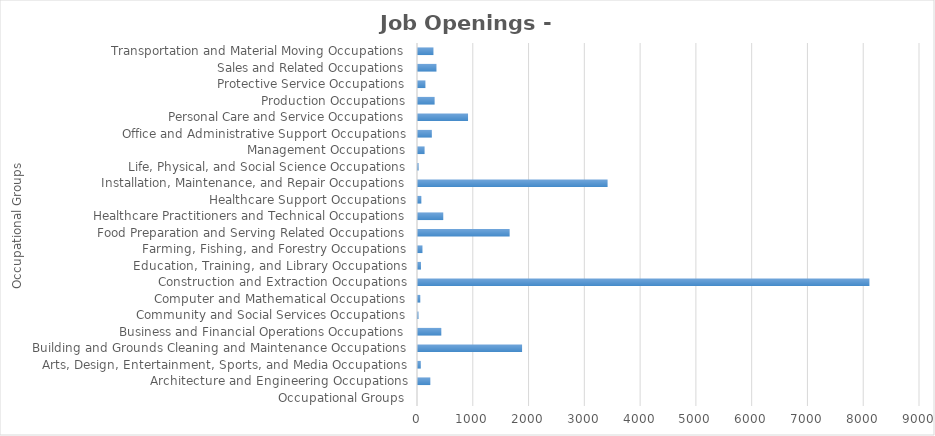
| Category | Series1 |
|---|---|
| Occupational Groups | 0 |
| Architecture and Engineering Occupations | 221 |
| Arts, Design, Entertainment, Sports, and Media Occupations | 50 |
| Building and Grounds Cleaning and Maintenance Occupations | 1866 |
| Business and Financial Operations Occupations | 418 |
| Community and Social Services Occupations | 9 |
| Computer and Mathematical Occupations | 41 |
| Construction and Extraction Occupations | 8093 |
| Education, Training, and Library Occupations | 53 |
| Farming, Fishing, and Forestry Occupations | 80 |
| Food Preparation and Serving Related Occupations | 1643 |
| Healthcare Practitioners and Technical Occupations | 453 |
| Healthcare Support Occupations | 60 |
| Installation, Maintenance, and Repair Occupations | 3399 |
| Life, Physical, and Social Science Occupations | 11 |
| Management Occupations | 118 |
| Office and Administrative Support Occupations | 248 |
| Personal Care and Service Occupations | 897 |
| Production Occupations | 298 |
| Protective Service Occupations | 133 |
| Sales and Related Occupations | 331 |
| Transportation and Material Moving Occupations | 277 |